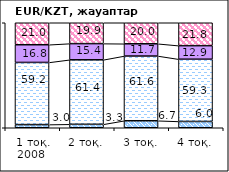
| Category | позитивно | не повлияло | негативно | не знаю |
|---|---|---|---|---|
| 1 тоқ. 2008  | 3.02 | 59.19 | 16.84 | 20.95 |
| 2 тоқ. | 3.29 | 61.43 | 15.4 | 19.88 |
| 3 тоқ. | 6.68 | 61.61 | 11.67 | 20.04 |
| 4 тоқ. | 6 | 59.29 | 12.89 | 21.82 |